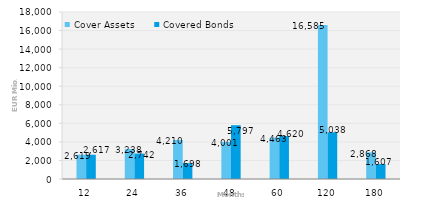
| Category | Cover Assets | Covered Bonds |
|---|---|---|
| 12.0 | 2618.68 | 2617.064 |
| 24.0 | 3237.903 | 2741.5 |
| 36.0 | 4210.397 | 1698 |
| 48.0 | 4000.923 | 5796.5 |
| 60.0 | 4462.725 | 4620 |
| 120.0 | 16585.357 | 5038 |
| 180.0 | 2868.468 | 1606.5 |